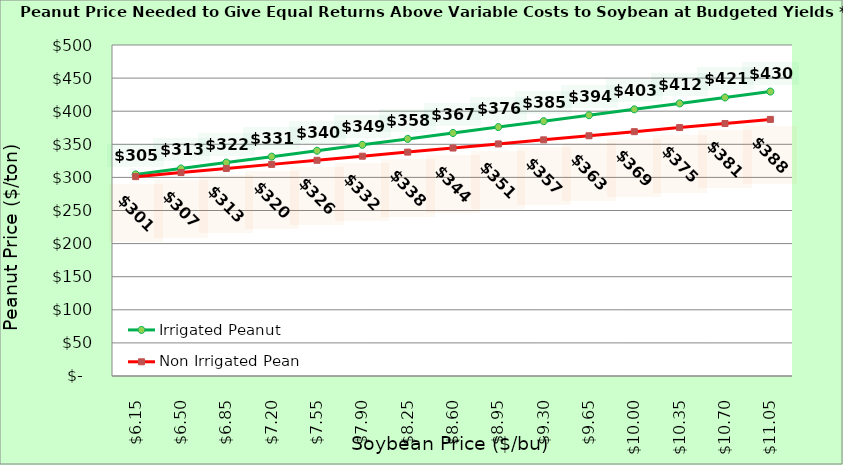
| Category | Irrigated Peanut | Non Irrigated Peanut |
|---|---|---|
| 6.150000000000002 | 304.536 | 301.14 |
| 6.500000000000002 | 313.472 | 307.316 |
| 6.850000000000001 | 322.408 | 313.493 |
| 7.200000000000001 | 331.345 | 319.669 |
| 7.550000000000001 | 340.281 | 325.845 |
| 7.9 | 349.217 | 332.022 |
| 8.25 | 358.153 | 338.198 |
| 8.6 | 367.089 | 344.375 |
| 8.95 | 376.025 | 350.551 |
| 9.299999999999999 | 384.962 | 356.728 |
| 9.649999999999999 | 393.898 | 362.904 |
| 9.999999999999998 | 402.834 | 369.081 |
| 10.349999999999998 | 411.77 | 375.257 |
| 10.699999999999998 | 420.706 | 381.434 |
| 11.049999999999997 | 429.642 | 387.61 |